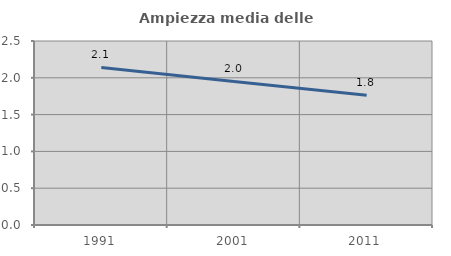
| Category | Ampiezza media delle famiglie |
|---|---|
| 1991.0 | 2.141 |
| 2001.0 | 1.951 |
| 2011.0 | 1.764 |